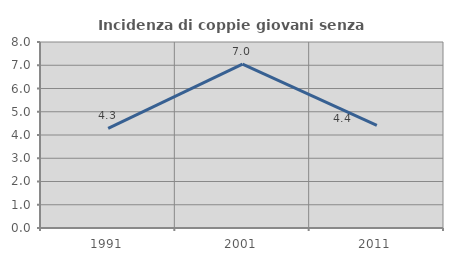
| Category | Incidenza di coppie giovani senza figli |
|---|---|
| 1991.0 | 4.281 |
| 2001.0 | 7.046 |
| 2011.0 | 4.419 |